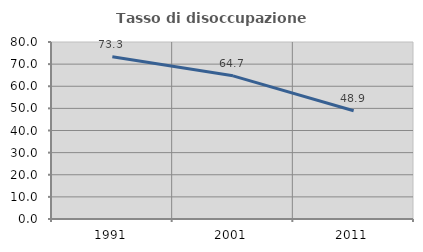
| Category | Tasso di disoccupazione giovanile  |
|---|---|
| 1991.0 | 73.301 |
| 2001.0 | 64.706 |
| 2011.0 | 48.936 |